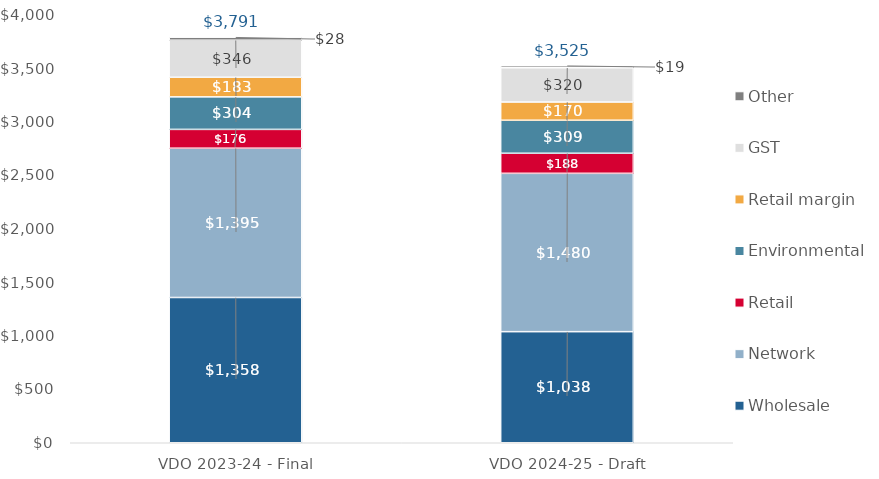
| Category | Wholesale | Network | Retail | Environmental | Retail margin | GST | Other |
|---|---|---|---|---|---|---|---|
| VDO 2023-24 - Final | 1357.552 | 1395.197 | 175.924 | 303.822 | 183.406 | 345.852 | 28.443 |
| VDO 2024-25 - Draft | 1038.16 | 1479.83 | 187.594 | 308.702 | 169.883 | 320.351 | 19.339 |